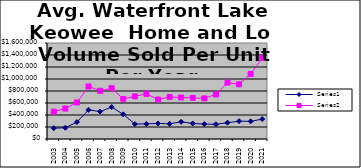
| Category | Series 0 | Series 1 |
|---|---|---|
| 2003.0 | 180188 | 456225 |
| 2004.0 | 187619 | 507014 |
| 2005.0 | 282153 | 609199 |
| 2006.0 | 485305 | 875482 |
| 2007.0 | 456742 | 803432 |
| 2008.0 | 532091 | 846541 |
| 2009.0 | 410777 | 667624 |
| 2010.0 | 249982 | 709658 |
| 2011.0 | 251757 | 752512 |
| 2012.0 | 259674 | 657878 |
| 2013.0 | 252883 | 700164 |
| 2014.0 | 286107 | 692125 |
| 2015.0 | 258976 | 686138 |
| 2016.0 | 249095 | 676553 |
| 2017.0 | 245481 | 743287 |
| 2018.0 | 271575 | 940258 |
| 2019.0 | 296997 | 911787 |
| 2020.0 | 294011 | 1082773 |
| 2021.0 | 331767 | 1349158 |